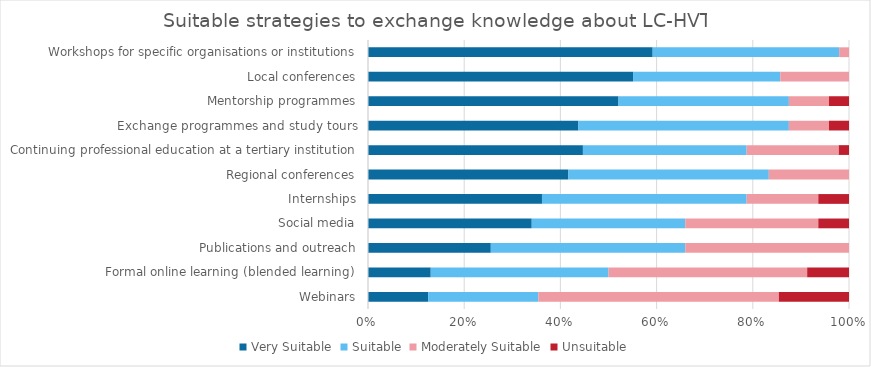
| Category | Very Suitable | Suitable | Moderately Suitable | Unsuitable |
|---|---|---|---|---|
| Webinars | 6 | 11 | 24 | 7 |
| Formal online learning (blended learning) | 6 | 17 | 19 | 4 |
| Publications and outreach | 12 | 19 | 16 | 0 |
| Social media | 16 | 15 | 13 | 3 |
| Internships | 17 | 20 | 7 | 3 |
| Regional conferences | 20 | 20 | 8 | 0 |
| Continuing professional education at a tertiary institution | 21 | 16 | 9 | 1 |
| Exchange programmes and study tours | 21 | 21 | 4 | 2 |
| Mentorship programmes | 25 | 17 | 4 | 2 |
| Local conferences | 27 | 15 | 7 | 0 |
| Workshops for specific organisations or institutions | 29 | 19 | 1 | 0 |